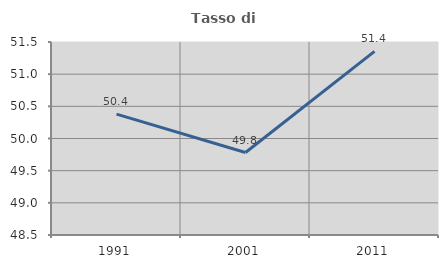
| Category | Tasso di occupazione   |
|---|---|
| 1991.0 | 50.378 |
| 2001.0 | 49.782 |
| 2011.0 | 51.354 |